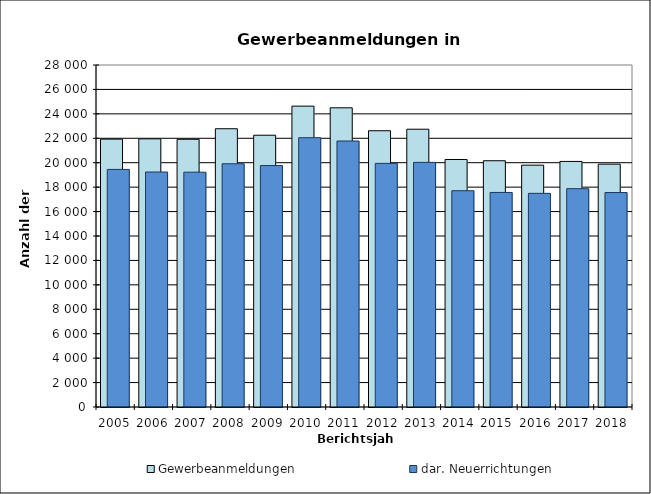
| Category | Gewerbeanmeldungen | dar. Neuerrichtungen |
|---|---|---|
| 2005.0 | 21931 | 19452 |
| 2006.0 | 21955 | 19238 |
| 2007.0 | 21918 | 19225 |
| 2008.0 | 22781 | 19914 |
| 2009.0 | 22250 | 19769 |
| 2010.0 | 24632 | 22046 |
| 2011.0 | 24495 | 21777 |
| 2012.0 | 22618 | 19945 |
| 2013.0 | 22743 | 20029 |
| 2014.0 | 20264 | 17706 |
| 2015.0 | 20162 | 17566 |
| 2016.0 | 19798 | 17492 |
| 2017.0 | 20105 | 17874 |
| 2018.0 | 19880 | 17558 |